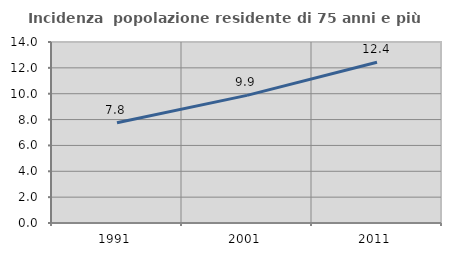
| Category | Incidenza  popolazione residente di 75 anni e più |
|---|---|
| 1991.0 | 7.759 |
| 2001.0 | 9.87 |
| 2011.0 | 12.43 |